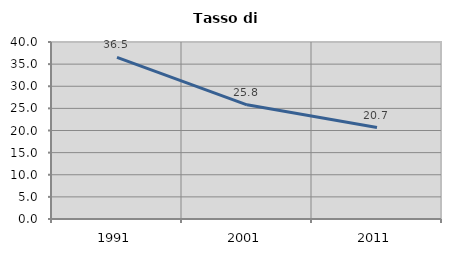
| Category | Tasso di disoccupazione   |
|---|---|
| 1991.0 | 36.533 |
| 2001.0 | 25.806 |
| 2011.0 | 20.659 |